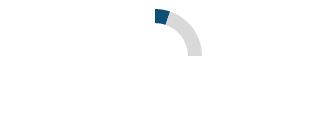
| Category | Series 0 |
|---|---|
| 0 | 0.052 |
| 1 | 0.198 |
| 2 | 0.75 |